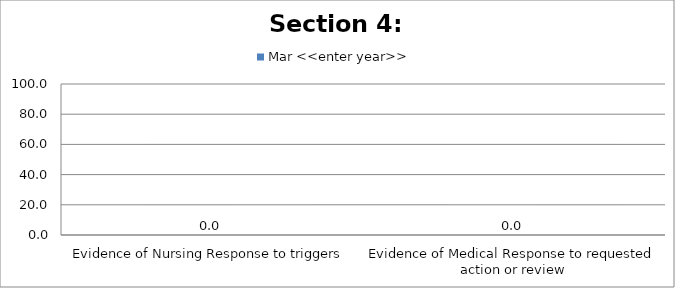
| Category | Mar <<enter year>> |
|---|---|
| Evidence of Nursing Response to triggers | 0 |
| Evidence of Medical Response to requested action or review | 0 |